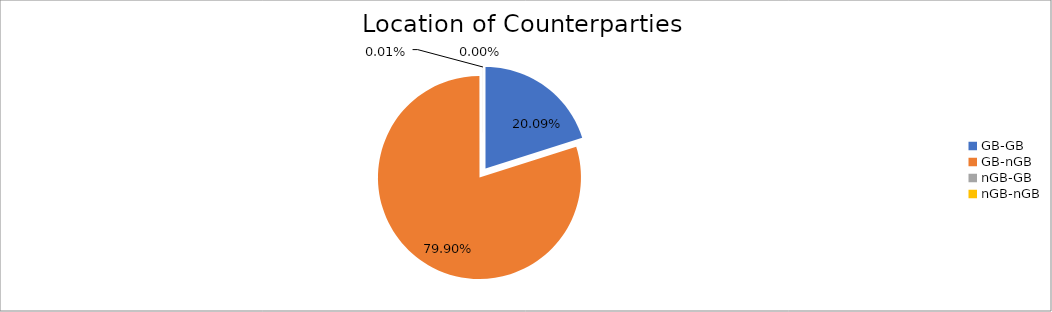
| Category | Series 0 |
|---|---|
| GB-GB | 1746289.308 |
| GB-nGB | 6945192.409 |
| nGB-GB | 963.404 |
| nGB-nGB | 120.836 |